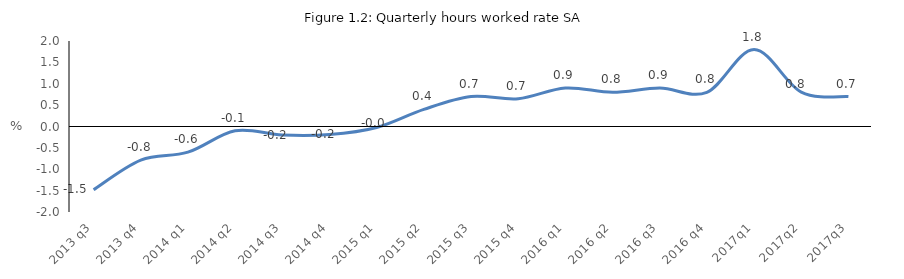
| Category | Series 0 |
|---|---|
| 2013 q3 | -1.478 |
| 2013 q4 | -0.785 |
| 2014 q1 | -0.6 |
| 2014 q2 | -0.1 |
| 2014 q3 | -0.2 |
| 2014 q4 | -0.189 |
| 2015 q1 | -0.023 |
| 2015 q2 | 0.4 |
| 2015 q3 | 0.7 |
| 2015 q4 | 0.65 |
| 2016 q1 | 0.9 |
| 2016 q2 | 0.8 |
| 2016 q3 | 0.9 |
| 2016 q4 | 0.8 |
| 2017q1 | 1.8 |
| 2017q2 | 0.805 |
| 2017q3 | 0.7 |